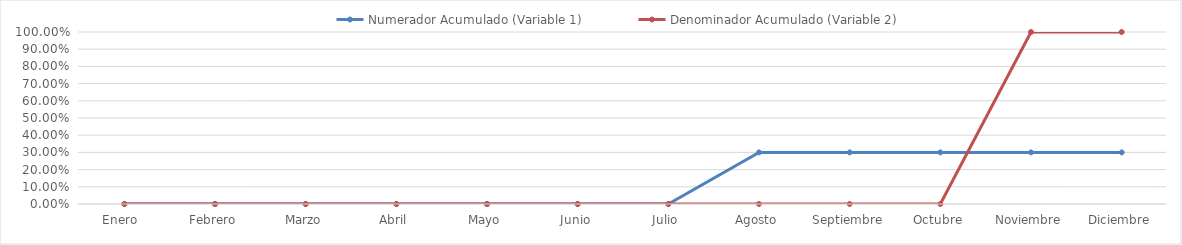
| Category | Numerador Acumulado (Variable 1) | Denominador Acumulado (Variable 2) |
|---|---|---|
| Enero  | 0 | 0 |
| Febrero | 0 | 0 |
| Marzo | 0 | 0 |
| Abril | 0 | 0 |
| Mayo | 0 | 0 |
| Junio | 0 | 0 |
| Julio | 0 | 0 |
| Agosto | 0.3 | 0 |
| Septiembre | 0.3 | 0 |
| Octubre | 0.3 | 0 |
| Noviembre | 0.3 | 1 |
| Diciembre | 0.3 | 1 |